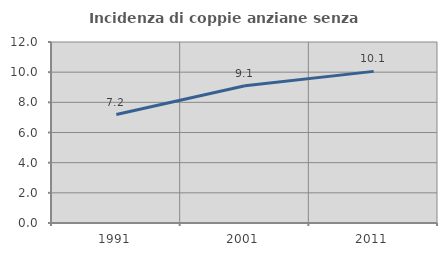
| Category | Incidenza di coppie anziane senza figli  |
|---|---|
| 1991.0 | 7.191 |
| 2001.0 | 9.094 |
| 2011.0 | 10.052 |